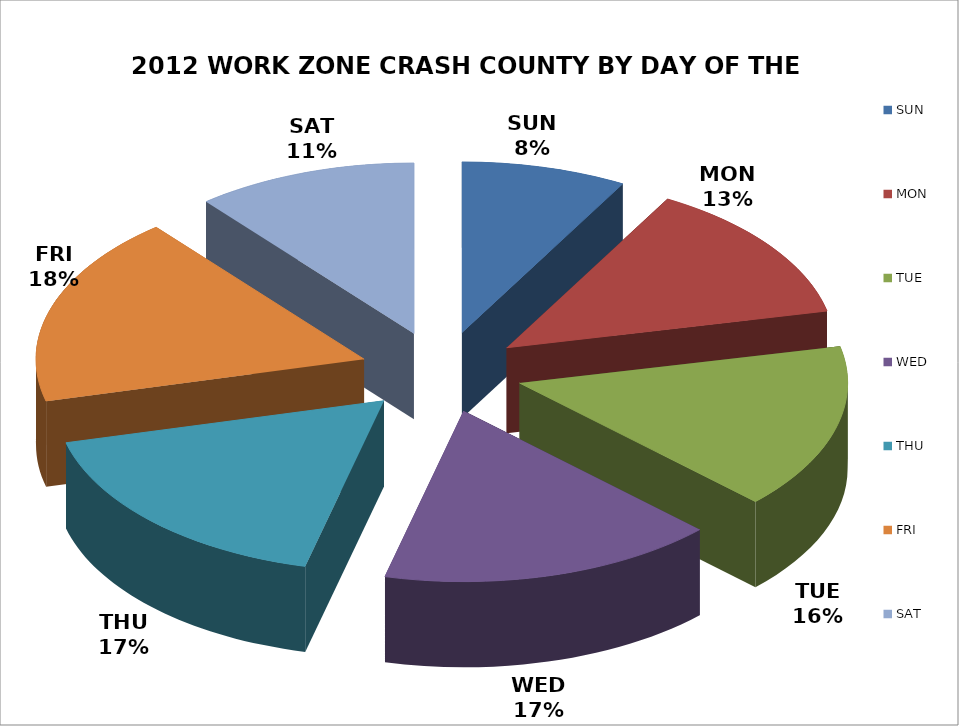
| Category | COUNT | % |
|---|---|---|
| SUN | 267 | 0.081 |
| MON | 439 | 0.134 |
| TUE | 514 | 0.157 |
| WED | 545 | 0.166 |
| THU | 563 | 0.172 |
| FRI | 591 | 0.18 |
| SAT | 358 | 0.109 |